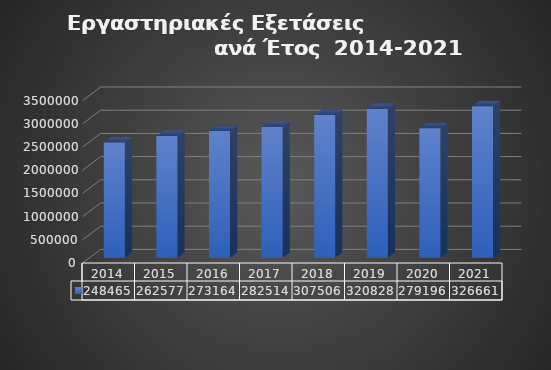
| Category | Series 0 |
|---|---|
| 2014.0 | 2484657 |
| 2015.0 | 2625773 |
| 2016.0 | 2731643 |
| 2017.0 | 2825145 |
| 2018.0 | 3075067 |
| 2019.0 | 3208287 |
| 2020.0 | 2791968 |
| 2021.0 | 3266615 |